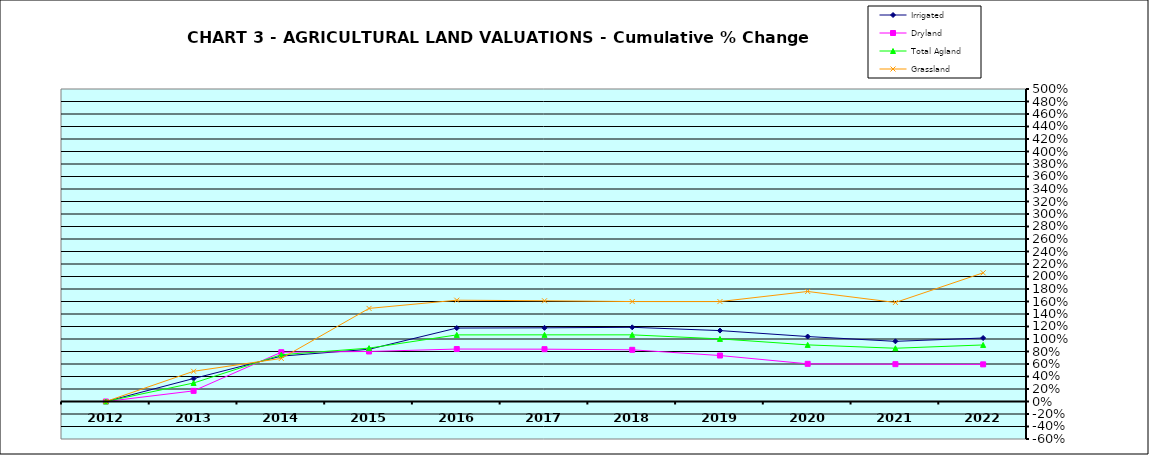
| Category | Irrigated | Dryland | Total Agland | Grassland |
|---|---|---|---|---|
| 2012.0 | 0 | 0 | 0 | 0 |
| 2013.0 | 0.367 | 0.17 | 0.296 | 0.483 |
| 2014.0 | 0.726 | 0.789 | 0.748 | 0.689 |
| 2015.0 | 0.835 | 0.8 | 0.854 | 1.49 |
| 2016.0 | 1.175 | 0.839 | 1.066 | 1.621 |
| 2017.0 | 1.179 | 0.837 | 1.066 | 1.612 |
| 2018.0 | 1.187 | 0.827 | 1.066 | 1.599 |
| 2019.0 | 1.135 | 0.736 | 1.002 | 1.599 |
| 2020.0 | 1.039 | 0.603 | 0.906 | 1.761 |
| 2021.0 | 0.963 | 0.597 | 0.852 | 1.584 |
| 2022.0 | 1.016 | 0.594 | 0.905 | 2.059 |